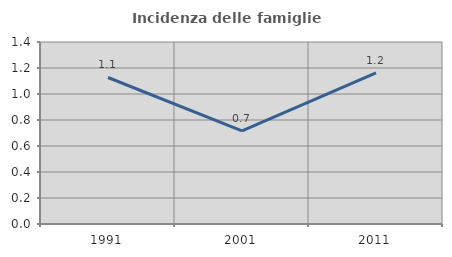
| Category | Incidenza delle famiglie numerose |
|---|---|
| 1991.0 | 1.127 |
| 2001.0 | 0.716 |
| 2011.0 | 1.162 |